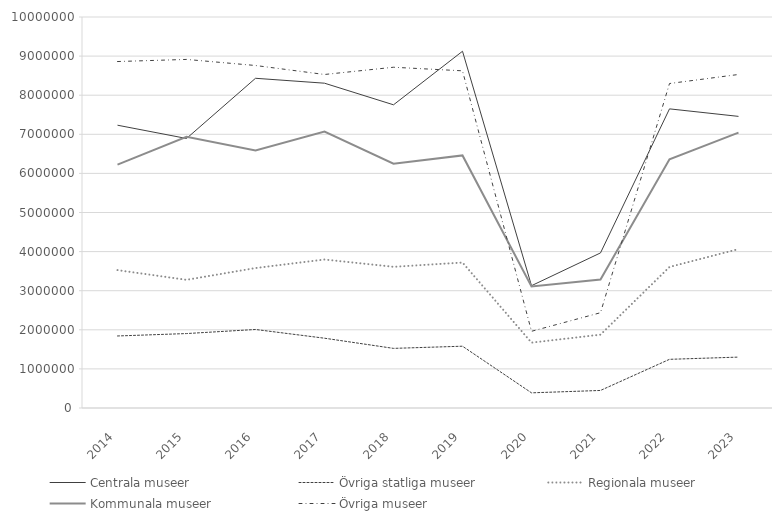
| Category | Centrala museer | Övriga statliga museer | Regionala museer | Kommunala museer | Övriga museer |
|---|---|---|---|---|---|
| 2014 | 7232500 | 1842114 | 3526369 | 6222753 | 8860949 |
| 2015 | 6893266 | 1903826 | 3278106 | 6937320 | 8914998 |
| 2016 | 8432578 | 2008141 | 3579799 | 6587608 | 8759738 |
| 2017 | 8307128 | 1785037 | 3797295 | 7072002 | 8529664 |
| 2018 | 7754381 | 1524880 | 3611090 | 6247657 | 8714960 |
| 2019 | 9123757 | 1580296 | 3720123 | 6459361 | 8623580 |
| 2020 | 3128359 | 387743 | 1671801 | 3109429 | 1961974 |
| 2021 | 3966394 | 448800 | 1875751 | 3286395 | 2436863 |
| 2022 | 7650629 | 1244860 | 3606747 | 6361879 | 8298601 |
| 2023 | 7458395 | 1301690 | 4064609 | 7043258 | 8530151 |